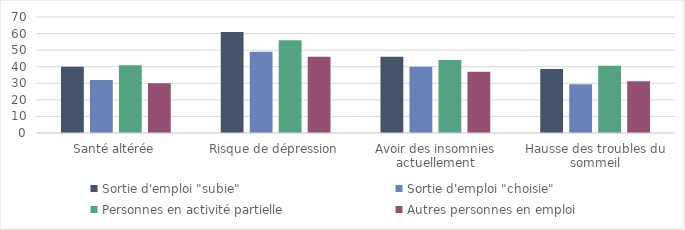
| Category | Sortie d'emploi "subie" | Sortie d'emploi "choisie" | Personnes en activité partielle | Autres personnes en emploi |
|---|---|---|---|---|
| Santé altérée | 40.03 | 32 | 40.95 | 29.99 |
| Risque de dépression | 61 | 49 | 56 | 46 |
| Avoir des insomnies actuellement | 46 | 40 | 44 | 37 |
| Hausse des troubles du sommeil | 38.64 | 29.38 | 40.63 | 31.23 |